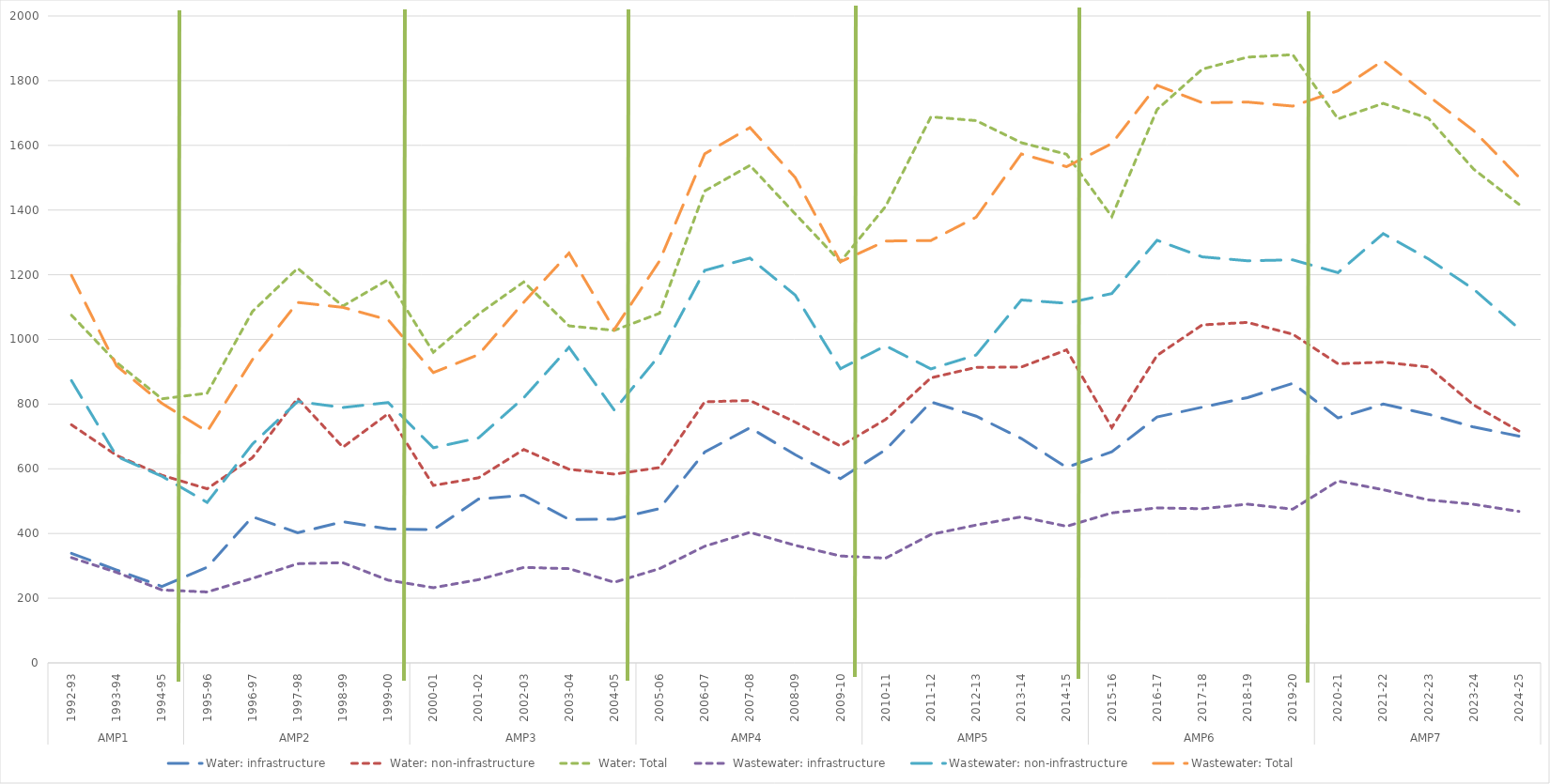
| Category | Water: infrastructure | Water: non-infrastructure | Water: Total | Wastewater: infrastructure | Wastewater: non-infrastructure | Wastewater: Total |
|---|---|---|---|---|---|---|
| 0 | 338.75 | 736.034 | 1074.784 | 325.343 | 872.766 | 1198.109 |
| 1 | 287.164 | 641.297 | 928.461 | 279.729 | 638.123 | 917.852 |
| 2 | 236.304 | 580.048 | 816.352 | 225.447 | 576.867 | 802.313 |
| 3 | 295.561 | 538.241 | 833.802 | 219.201 | 496.039 | 715.24 |
| 4 | 451.763 | 634.392 | 1086.155 | 261.235 | 676.21 | 937.445 |
| 5 | 402.22 | 817.734 | 1219.953 | 306.51 | 807.878 | 1114.389 |
| 6 | 436.359 | 666.804 | 1103.163 | 309.621 | 789.444 | 1099.066 |
| 7 | 414.215 | 770.345 | 1184.56 | 255.755 | 804.9 | 1060.655 |
| 8 | 411.588 | 548.527 | 960.115 | 232.434 | 665.051 | 897.486 |
| 9 | 506.333 | 572.227 | 1078.56 | 257.289 | 695.6 | 952.889 |
| 10 | 518.082 | 659.656 | 1177.738 | 295.105 | 819.917 | 1115.021 |
| 11 | 443.281 | 598.567 | 1041.848 | 291.298 | 975.601 | 1266.898 |
| 12 | 444.462 | 583.467 | 1027.929 | 249.162 | 781.591 | 1030.753 |
| 13 | 476.869 | 603.831 | 1080.7 | 291.312 | 951.036 | 1242.349 |
| 14 | 651.715 | 807.271 | 1458.986 | 360.552 | 1213.31 | 1573.862 |
| 15 | 726.91 | 811.05 | 1537.961 | 403.489 | 1251.43 | 1654.919 |
| 16 | 643.494 | 744.535 | 1388.029 | 363.428 | 1137.115 | 1500.543 |
| 17 | 569.732 | 670.453 | 1240.186 | 330.505 | 909.439 | 1239.944 |
| 18 | 658.755 | 752.606 | 1411.361 | 323.787 | 980.345 | 1304.133 |
| 19 | 806.878 | 881.155 | 1688.033 | 396.976 | 908.775 | 1305.75 |
| 20 | 762.843 | 913.568 | 1676.411 | 426.144 | 951.768 | 1377.912 |
| 21 | 693.518 | 914.645 | 1608.163 | 451.467 | 1121.959 | 1573.426 |
| 22 | 604.688 | 967.717 | 1572.405 | 422.237 | 1111.817 | 1534.054 |
| 23 | 652.36 | 727.426 | 1379.786 | 463.679 | 1141.791 | 1605.47 |
| 24 | 760.184 | 950.476 | 1710.66 | 479.192 | 1306.455 | 1785.648 |
| 25 | 790.539 | 1045.018 | 1835.556 | 476.61 | 1255.182 | 1731.793 |
| 26 | 820.141 | 1052.548 | 1872.689 | 490.726 | 1243.081 | 1733.807 |
| 27 | 864.235 | 1016.07 | 1880.305 | 475.254 | 1246.01 | 1721.264 |
| 28 | 757.123 | 924.706 | 1681.829 | 562.417 | 1206.372 | 1768.789 |
| 29 | 800.1 | 929.679 | 1729.778 | 535.29 | 1327 | 1862.29 |
| 30 | 768.759 | 914.827 | 1683.585 | 503.847 | 1248.865 | 1752.712 |
| 31 | 729.046 | 797.21 | 1526.256 | 490.236 | 1155.167 | 1645.403 |
| 32 | 701.148 | 716.687 | 1417.835 | 468.239 | 1033.394 | 1501.633 |